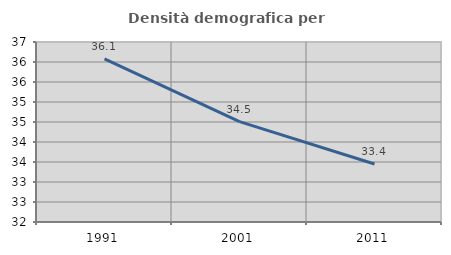
| Category | Densità demografica |
|---|---|
| 1991.0 | 36.08 |
| 2001.0 | 34.508 |
| 2011.0 | 33.449 |